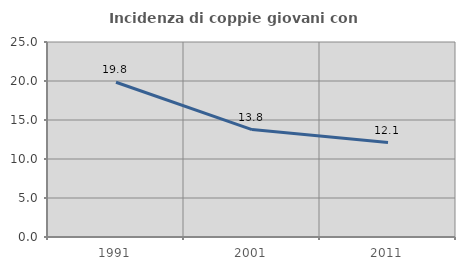
| Category | Incidenza di coppie giovani con figli |
|---|---|
| 1991.0 | 19.841 |
| 2001.0 | 13.768 |
| 2011.0 | 12.102 |